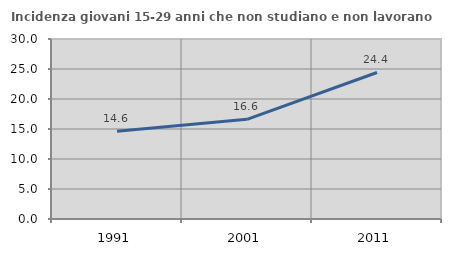
| Category | Incidenza giovani 15-29 anni che non studiano e non lavorano  |
|---|---|
| 1991.0 | 14.634 |
| 2001.0 | 16.61 |
| 2011.0 | 24.419 |